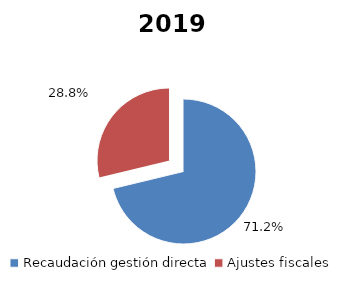
| Category | 2019 |
|---|---|
| Recaudación gestión directa | 2807277 |
| Ajustes fiscales | 1133854.996 |